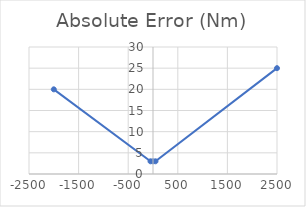
| Category | absolute error |
|---|---|
| -2000.0 | 20 |
| -50.0 | 3 |
| 0.0 | 3 |
| 50.0 | 3 |
| 2500.0 | 25 |